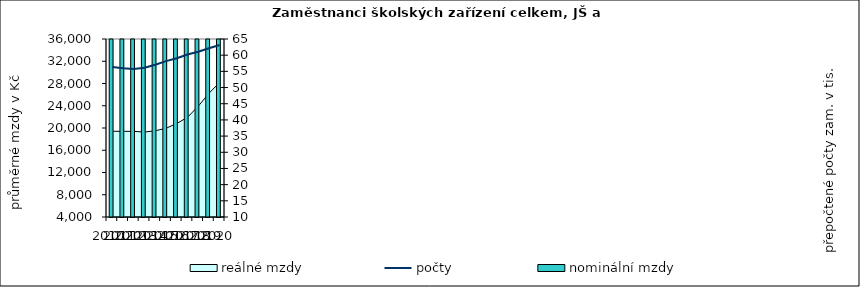
| Category | nominální mzdy  |
|---|---|
| 2010.0 | 18049.52 |
| 2011.0 | 18395.427 |
| 2012.0 | 18988.329 |
| 2013.0 | 19139.049 |
| 2014.0 | 19441.575 |
| 2015.0 | 19947.281 |
| 2016.0 | 20952.977 |
| 2017.0 | 22593.048 |
| 2018.0 | 25171.383 |
| 2019.0 | 28412.145 |
| 2020.0 | 31375.66 |